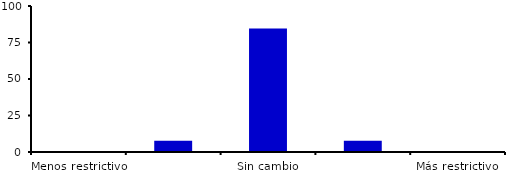
| Category | Series 0 |
|---|---|
| Menos restrictivo | 0 |
| Moderadamente menos restrictivo | 7.692 |
| Sin cambio | 84.615 |
| Moderadamente más restrictivo | 7.692 |
| Más restrictivo | 0 |